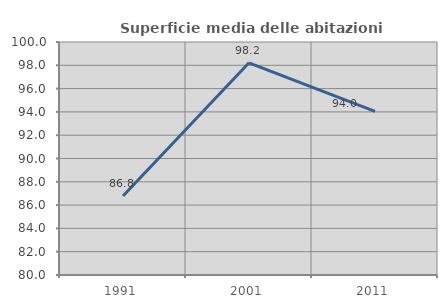
| Category | Superficie media delle abitazioni occupate |
|---|---|
| 1991.0 | 86.782 |
| 2001.0 | 98.215 |
| 2011.0 | 94.048 |